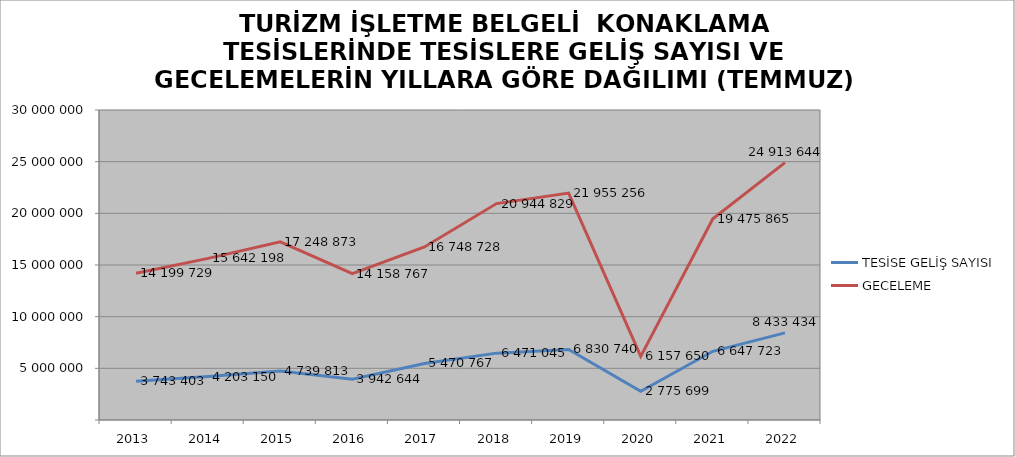
| Category | TESİSE GELİŞ SAYISI | GECELEME |
|---|---|---|
| 2013 | 3743403 | 14199729 |
| 2014 | 4203150 | 15642198 |
| 2015 | 4739813 | 17248873 |
| 2016 | 3942644 | 14158767 |
| 2017 | 5470767 | 16748728 |
| 2018 | 6471045 | 20944829 |
| 2019 | 6830740 | 21955256 |
| 2020 | 2775699 | 6157650 |
| 2021 | 6647723 | 19475865 |
| 2022 | 8433434 | 24913644 |